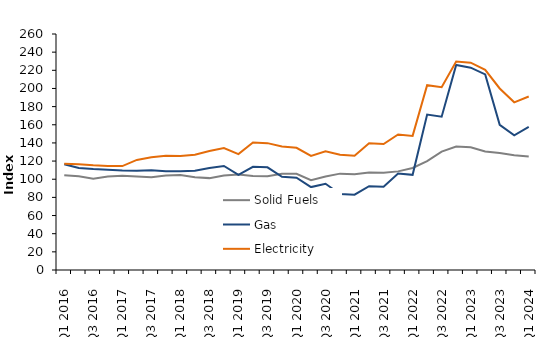
| Category | Solid Fuels | Gas | Electricity |
|---|---|---|---|
| Q1 2016 | 104.436 | 116.552 | 117.105 |
| Q2 2016 | 103.17 | 112.327 | 116.497 |
| Q3 2016 | 100.651 | 111.259 | 115.39 |
| Q4 2016 | 103.076 | 110.559 | 114.663 |
| Q1 2017 | 103.755 | 109.51 | 114.523 |
| Q2 2017 | 102.943 | 109.274 | 121.273 |
| Q3 2017 | 102.127 | 109.867 | 124.232 |
| Q4 2017 | 104.088 | 108.846 | 125.794 |
| Q1 2018 | 104.775 | 108.854 | 125.535 |
| Q2 2018 | 102.239 | 109.458 | 126.897 |
| Q3 2018 | 101.223 | 112.468 | 131.166 |
| Q4 2018 | 104.039 | 114.642 | 134.316 |
| Q1 2019 | 105.21 | 104.83 | 127.649 |
| Q2 2019 | 103.588 | 113.721 | 140.463 |
| Q3 2019 | 103.265 | 113.154 | 139.763 |
| Q4 2019 | 106.022 | 102.632 | 135.999 |
| Q1 2020 | 106.03 | 101.625 | 134.664 |
| Q2 2020 | 99.027 | 91.355 | 125.633 |
| Q3 2020 | 103.079 | 94.985 | 130.669 |
| Q4 2020 | 106.164 | 83.699 | 126.876 |
| Q1 2021 | 105.535 | 82.986 | 125.794 |
| Q2 2021 | 107.449 | 92.278 | 139.562 |
| Q3 2021 | 107.009 | 91.66 | 138.838 |
| Q4 2021 | 108.653 | 106.198 | 149.317 |
| Q1 2022 | 112.389 | 104.817 | 147.739 |
| Q2 2022 | 119.899 | 171.251 | 203.577 |
| Q3 2022 | 130.483 | 168.834 | 201.35 |
| Q4 2022 | 135.959 | 225.858 | 229.713 |
| Q1 2023 | 135.321 | 222.927 | 228.403 |
| Q2 2023 | 130.562 | 215.461 | 220.595 |
| Q3 2023 | 128.925 | 159.88 | 200.005 |
| Q4 2023 | 126.514 | 148.367 | 184.72 |
| Q1 2024 | 124.969 | 157.555 | 191.121 |